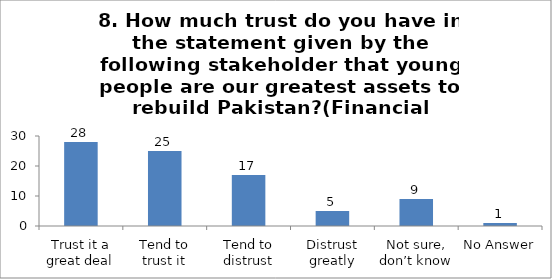
| Category | 8. How much trust do you have in the statement given by the following stakeholder that young people are our greatest assets to rebuild Pakistan?(Financial Institutions) |
|---|---|
| Trust it a great deal | 28 |
| Tend to trust it | 25 |
| Tend to distrust | 17 |
| Distrust greatly | 5 |
| Not sure, don’t know | 9 |
| No Answer | 1 |